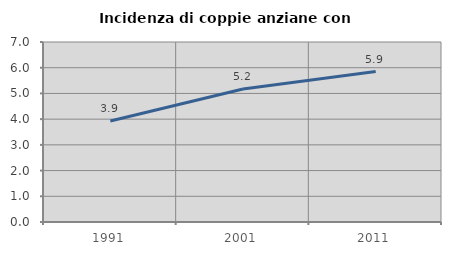
| Category | Incidenza di coppie anziane con figli |
|---|---|
| 1991.0 | 3.927 |
| 2001.0 | 5.172 |
| 2011.0 | 5.852 |